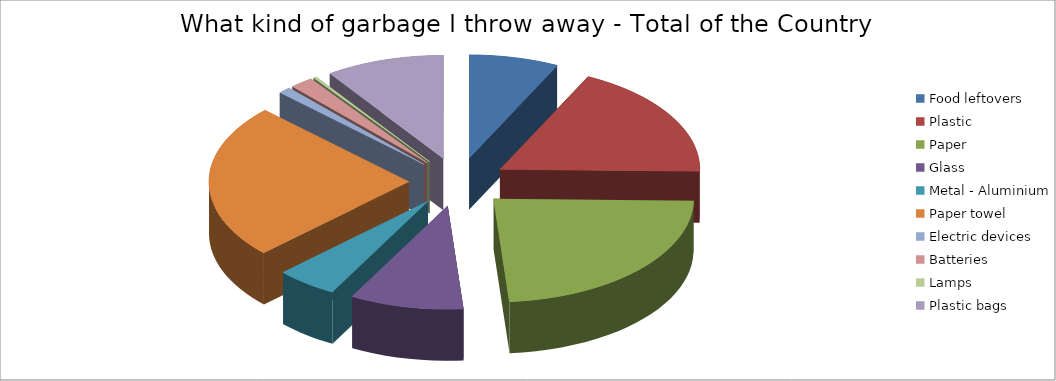
| Category | Food leftovers | What kind of garbage I throw away - Total of the Country |
|---|---|---|
| Food leftovers | 4.976 |  |
| Plastic | 12.353 |  |
| Paper | 16.059 |  |
| Glass | 6.294 |  |
| Metal - Aluminium | 3.412 |  |
| Paper towel | 16.647 |  |
| Electric devices | 0.706 |  |
| Batteries | 1.294 |  |
| Lamps | 0.176 |  |
| Plastic bags | 6.588 |  |